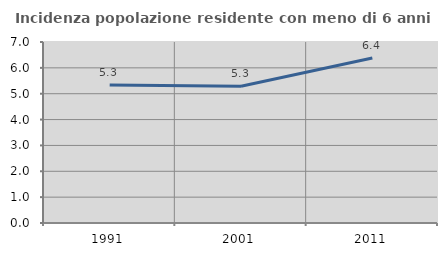
| Category | Incidenza popolazione residente con meno di 6 anni |
|---|---|
| 1991.0 | 5.337 |
| 2001.0 | 5.291 |
| 2011.0 | 6.381 |